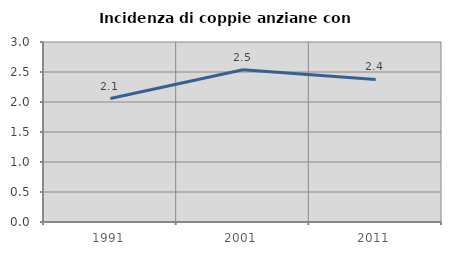
| Category | Incidenza di coppie anziane con figli |
|---|---|
| 1991.0 | 2.058 |
| 2001.0 | 2.537 |
| 2011.0 | 2.377 |